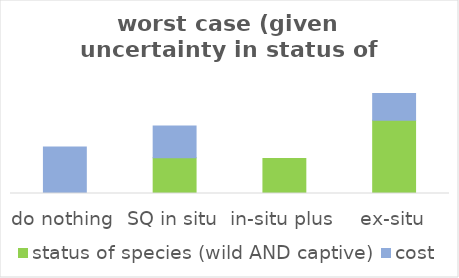
| Category | status of species (wild AND captive) | cost |
|---|---|---|
| do nothing | 0 | 0.231 |
| SQ in situ | 0.177 | 0.158 |
| in-situ plus | 0.173 | 0 |
| ex-situ | 0.364 | 0.132 |